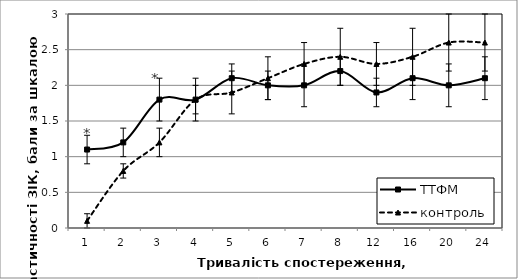
| Category | ТТФМ | контроль |
|---|---|---|
| 1.0 | 1.1 | 0.1 |
| 2.0 | 1.2 | 0.8 |
| 3.0 | 1.8 | 1.2 |
| 4.0 | 1.8 | 1.8 |
| 5.0 | 2.1 | 1.9 |
| 6.0 | 2 | 2.1 |
| 7.0 | 2 | 2.3 |
| 8.0 | 2.2 | 2.4 |
| 12.0 | 1.9 | 2.3 |
| 16.0 | 2.1 | 2.4 |
| 20.0 | 2 | 2.6 |
| 24.0 | 2.1 | 2.6 |